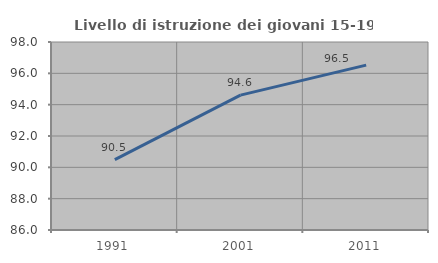
| Category | Livello di istruzione dei giovani 15-19 anni |
|---|---|
| 1991.0 | 90.492 |
| 2001.0 | 94.609 |
| 2011.0 | 96.522 |